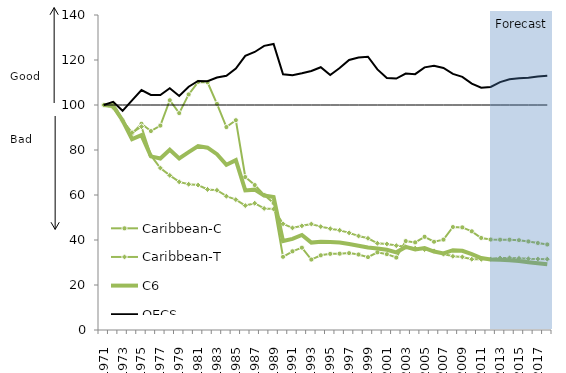
| Category | Caribbean-C | Caribbean-T | C6 | OECS | Series 4 |
|---|---|---|---|---|---|
| 1971.0 | 100 | 100 | 100 | 100 | 100 |
| 1972.0 | 100.747 | 98.849 | 99.516 | 101.401 | 100 |
| 1973.0 | 93.31 | 92.937 | 93.098 | 97.415 | 100 |
| 1974.0 | 87.201 | 87.745 | 84.842 | 102.066 | 100 |
| 1975.0 | 91.631 | 90.369 | 86.605 | 106.642 | 100 |
| 1976.0 | 88.412 | 77.58 | 77.188 | 104.491 | 100 |
| 1977.0 | 90.852 | 72.004 | 76.209 | 104.443 | 100 |
| 1978.0 | 102.118 | 68.713 | 80.135 | 107.457 | 100 |
| 1979.0 | 96.388 | 65.839 | 76.272 | 104.015 | 100 |
| 1980.0 | 104.702 | 64.789 | 79.022 | 108.137 | 100 |
| 1981.0 | 110.208 | 64.401 | 81.766 | 110.68 | 100 |
| 1982.0 | 110.107 | 62.476 | 81.039 | 110.593 | 100 |
| 1983.0 | 100.533 | 62.107 | 78.125 | 112.228 | 100 |
| 1984.0 | 90.195 | 59.463 | 73.452 | 113.02 | 100 |
| 1985.0 | 93.245 | 57.951 | 75.488 | 116.173 | 100 |
| 1986.0 | 67.989 | 55.303 | 62.051 | 121.821 | 100 |
| 1987.0 | 64.423 | 56.344 | 62.38 | 123.569 | 100 |
| 1988.0 | 60.001 | 54.019 | 59.743 | 126.289 | 100 |
| 1989.0 | 56.451 | 53.75 | 59.115 | 127.114 | 100 |
| 1990.0 | 32.521 | 47.202 | 39.528 | 113.63 | 100 |
| 1991.0 | 34.983 | 45.386 | 40.519 | 113.178 | 100 |
| 1992.0 | 36.588 | 46.303 | 42.218 | 114.077 | 100 |
| 1993.0 | 31.316 | 47.105 | 38.857 | 115.144 | 100 |
| 1994.0 | 33.191 | 45.96 | 39.266 | 116.794 | 100 |
| 1995.0 | 33.839 | 45.039 | 39.101 | 113.327 | 100 |
| 1996.0 | 33.92 | 44.329 | 38.874 | 116.423 | 100 |
| 1997.0 | 34.168 | 43.179 | 38.203 | 120.034 | 100 |
| 1998.0 | 33.552 | 41.778 | 37.446 | 121.107 | 100 |
| 1999.0 | 32.381 | 40.75 | 36.694 | 121.461 | 100 |
| 2000.0 | 34.527 | 38.55 | 36.258 | 115.833 | 100 |
| 2001.0 | 33.702 | 38.254 | 35.656 | 112.044 | 100 |
| 2002.0 | 32.199 | 37.513 | 34.525 | 111.758 | 100 |
| 2003.0 | 39.522 | 36.952 | 36.917 | 113.973 | 100 |
| 2004.0 | 38.946 | 36.353 | 35.776 | 113.722 | 100 |
| 2005.0 | 41.413 | 35.764 | 36.412 | 116.716 | 100 |
| 2006.0 | 39.227 | 35.187 | 34.85 | 117.446 | 100 |
| 2007.0 | 40.177 | 33.743 | 34.062 | 116.444 | 100 |
| 2008.0 | 45.77 | 32.75 | 35.461 | 113.814 | 100 |
| 2009.0 | 45.608 | 32.484 | 35.202 | 112.508 | 100 |
| 2010.0 | 43.858 | 31.444 | 33.688 | 109.534 | 100 |
| 2011.0 | 40.914 | 31.391 | 31.979 | 107.716 | 100 |
| 2012.0 | 40.212 | 31.506 | 31.373 | 108.009 | 100 |
| 2013.0 | 40.148 | 31.976 | 31.178 | 110.163 | 100 |
| 2014.0 | 40.117 | 32.055 | 30.953 | 111.447 | 100 |
| 2015.0 | 39.925 | 31.864 | 30.624 | 111.896 | 100 |
| 2016.0 | 39.358 | 31.653 | 30.146 | 112.143 | 100 |
| 2017.0 | 38.647 | 31.559 | 29.662 | 112.686 | 100 |
| 2018.0 | 38.008 | 31.485 | 29.229 | 112.991 | 100 |